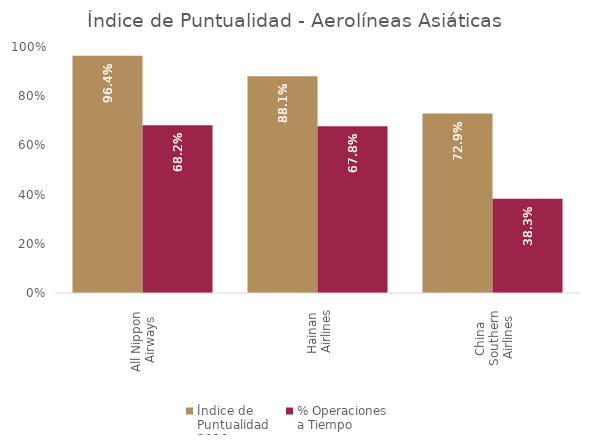
| Category | Índice de 
Puntualidad
2019 | % Operaciones 
a Tiempo |
|---|---|---|
| All Nippon 
Airways | 0.964 | 0.682 |
| Hainan 
Airlines | 0.881 | 0.678 |
| China 
Southern 
Airlines | 0.729 | 0.383 |